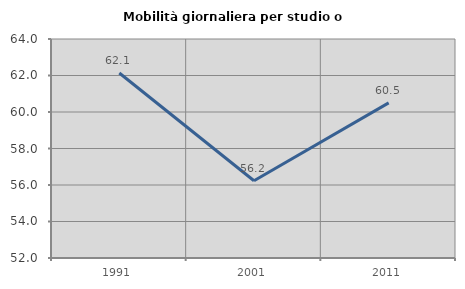
| Category | Mobilità giornaliera per studio o lavoro |
|---|---|
| 1991.0 | 62.139 |
| 2001.0 | 56.234 |
| 2011.0 | 60.502 |